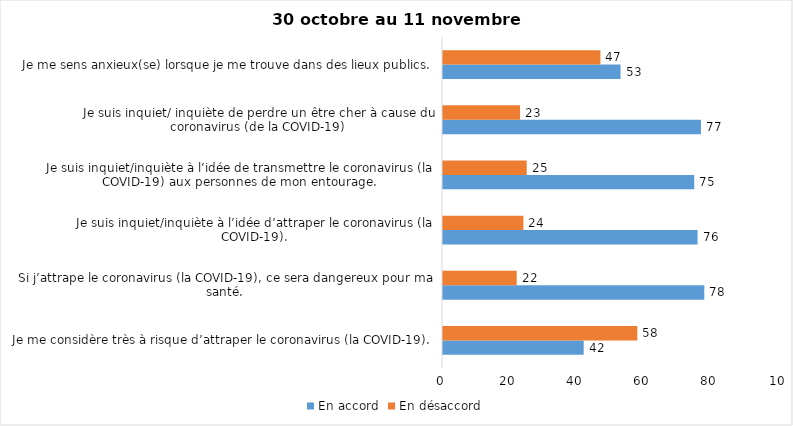
| Category | En accord | En désaccord |
|---|---|---|
| Je me considère très à risque d’attraper le coronavirus (la COVID-19). | 42 | 58 |
| Si j’attrape le coronavirus (la COVID-19), ce sera dangereux pour ma santé. | 78 | 22 |
| Je suis inquiet/inquiète à l’idée d’attraper le coronavirus (la COVID-19). | 76 | 24 |
| Je suis inquiet/inquiète à l’idée de transmettre le coronavirus (la COVID-19) aux personnes de mon entourage. | 75 | 25 |
| Je suis inquiet/ inquiète de perdre un être cher à cause du coronavirus (de la COVID-19) | 77 | 23 |
| Je me sens anxieux(se) lorsque je me trouve dans des lieux publics. | 53 | 47 |